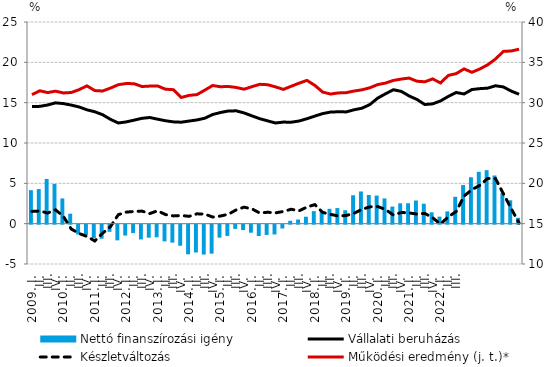
| Category | Nettó finanszírozási igény |
|---|---|
| 2009. I. | 4.156 |
|          II. | 4.29 |
|          III. | 5.545 |
|          IV. | 4.935 |
| 2010. I. | 3.13 |
|          II. | 1.236 |
|          III. | -1.214 |
|          IV. | -1.287 |
| 2011. I. | -1.668 |
|          II. | -1.744 |
|          III. | -0.885 |
|          IV. | -1.945 |
| 2012. I. | -1.349 |
|          II. | -1.042 |
|          III. | -1.828 |
|          IV. | -1.616 |
| 2013. I. | -1.564 |
| II. | -2.071 |
|          III. | -2.225 |
| IV. | -2.613 |
| 2014. I. | -3.675 |
| II. | -3.449 |
|          III. | -3.702 |
| IV. | -3.595 |
| 2015. I. | -1.61 |
| II. | -1.397 |
|          III. | -0.523 |
| IV. | -0.664 |
| 2016. I. | -0.997 |
| II. | -1.404 |
|          III. | -1.277 |
| IV. | -1.214 |
| 2017. I. | -0.473 |
| II. | 0.355 |
|          III. | 0.515 |
| IV. | 0.862 |
| 2018. I. | 1.554 |
| II. | 1.427 |
|          III. | 1.84 |
| IV. | 1.933 |
| 2019. I. | 1.663 |
| II. | 3.524 |
|          III. | 3.992 |
| IV. | 3.557 |
| 2020. I. | 3.48 |
| II. | 3.13 |
|          III. | 2.117 |
| IV. | 2.525 |
| 2021. I. | 2.53 |
| II. | 2.87 |
|          III. | 2.476 |
| IV. | 1.41 |
| 2022. I. | 0.871 |
| II. | 1.518 |
|          III. | 3.333 |